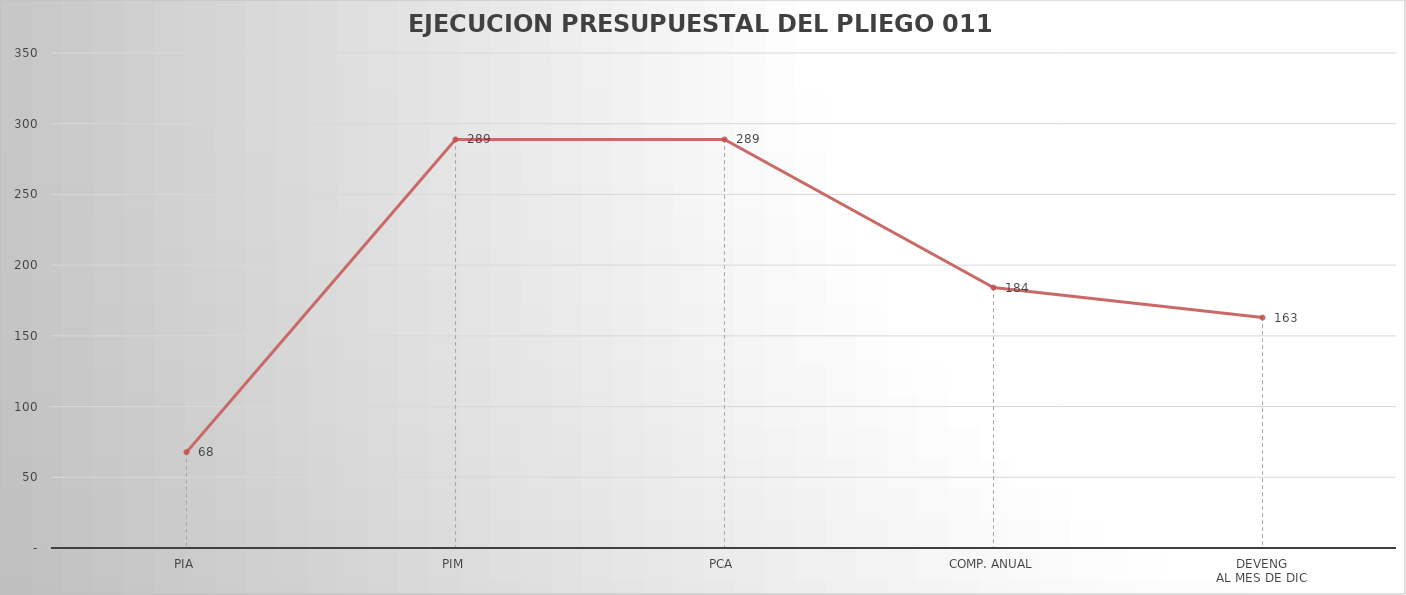
| Category | Series 0 |
|---|---|
| PIA | 67.768 |
| PIM | 288.87 |
| PCA | 288.87 |
| COMP. ANUAL | 184.145 |
| DEVENG
AL MES DE DIC | 162.922 |